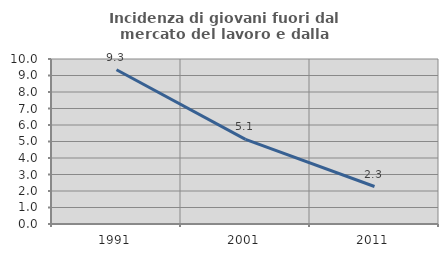
| Category | Incidenza di giovani fuori dal mercato del lavoro e dalla formazione  |
|---|---|
| 1991.0 | 9.346 |
| 2001.0 | 5.128 |
| 2011.0 | 2.273 |